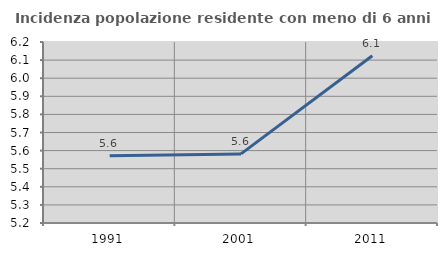
| Category | Incidenza popolazione residente con meno di 6 anni |
|---|---|
| 1991.0 | 5.571 |
| 2001.0 | 5.582 |
| 2011.0 | 6.124 |